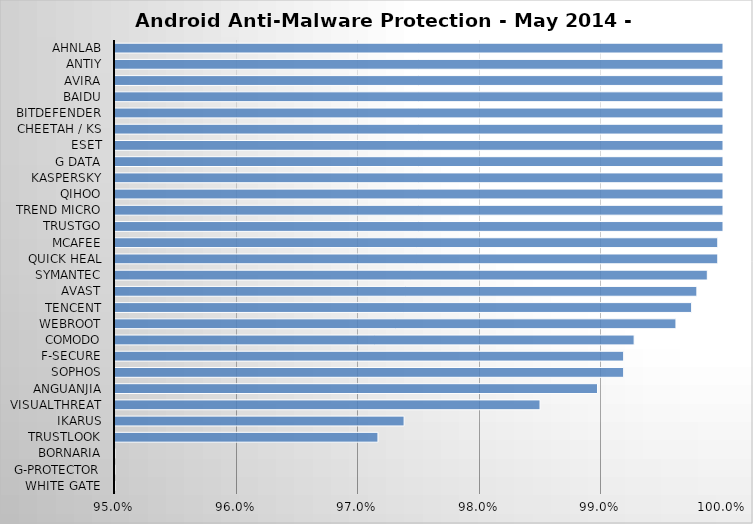
| Category | Series 0 |
|---|---|
| White Gate | 0.723 |
| G-Protector | 0.847 |
| Bornaria | 0.856 |
| Trustlook | 0.972 |
| Ikarus | 0.974 |
| VisualThreat | 0.985 |
| Anguanjia | 0.99 |
| Sophos | 0.992 |
| F-Secure | 0.992 |
| Comodo | 0.993 |
| Webroot | 0.996 |
| Tencent | 0.997 |
| Avast | 0.998 |
| Symantec | 0.999 |
| Quick Heal | 1 |
| McAfee | 1 |
| TrustGo | 1 |
| Trend Micro | 1 |
| Qihoo | 1 |
| Kaspersky | 1 |
| G Data | 1 |
| ESET | 1 |
| Cheetah / KS | 1 |
| Bitdefender | 1 |
| Baidu | 1 |
| Avira | 1 |
| Antiy | 1 |
| AhnLab | 1 |